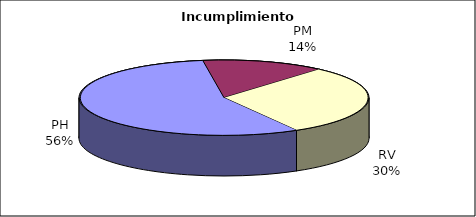
| Category | Valores |
|---|---|
| PH | 285 |
| PM | 70 |
| RV | 154 |